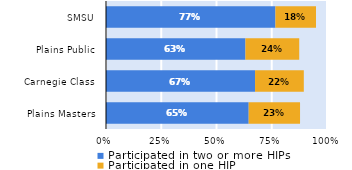
| Category | Participated in two or more HIPs | Participated in one HIP |
|---|---|---|
| Plains Masters | 0.646 | 0.232 |
| Carnegie Class | 0.674 | 0.221 |
| Plains Public | 0.631 | 0.243 |
| SMSU | 0.767 | 0.184 |